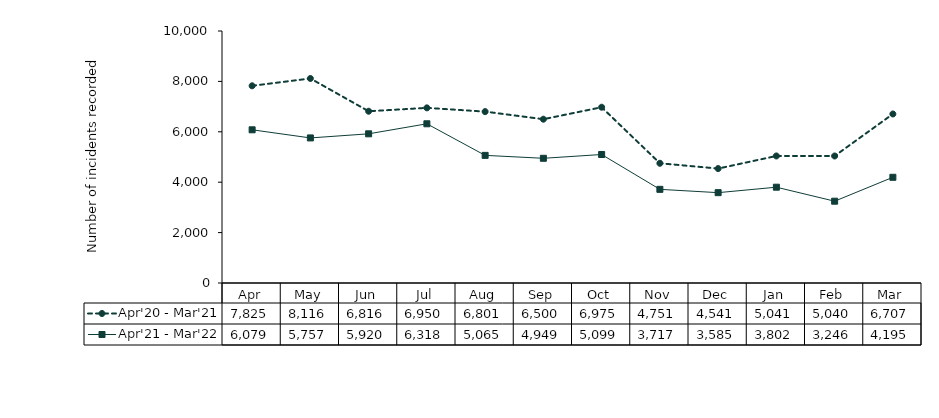
| Category | Apr'20 - Mar'21 | Apr'21 - Mar'22 |
|---|---|---|
| Apr | 7825 | 6079 |
| May | 8116 | 5757 |
| Jun | 6816 | 5920 |
| Jul | 6950 | 6318 |
| Aug | 6801 | 5065 |
| Sep | 6500 | 4949 |
| Oct | 6975 | 5099 |
| Nov | 4751 | 3717 |
| Dec | 4541 | 3585 |
| Jan | 5041 | 3802 |
| Feb | 5040 | 3246 |
| Mar | 6707 | 4195 |